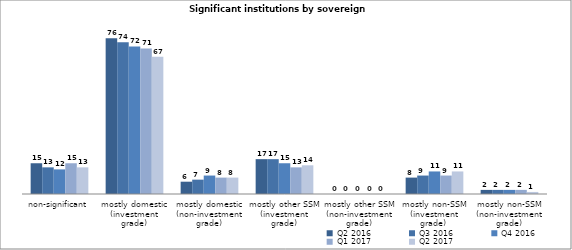
| Category | Q2 2016 | Q3 2016 | Q4 2016 | Q1 2017 | Q2 2017 |
|---|---|---|---|---|---|
| non-significant | 15 | 13 | 12 | 15 | 13 |
| mostly domestic
(investment grade) | 76 | 74 | 72 | 71 | 67 |
| mostly domestic
(non-investment grade) | 6 | 7 | 9 | 8 | 8 |
| mostly other SSM
(investment grade) | 17 | 17 | 15 | 13 | 14 |
| mostly other SSM
(non-investment grade) | 0 | 0 | 0 | 0 | 0 |
| mostly non-SSM
(investment grade)  | 8 | 9 | 11 | 9 | 11 |
| mostly non-SSM
(non-investment grade) | 2 | 2 | 2 | 2 | 1 |